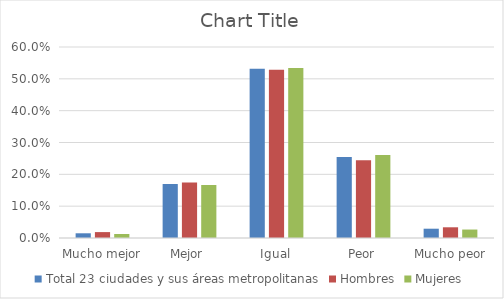
| Category | Total 23 ciudades y sus áreas metropolitanas | Hombres | Mujeres |
|---|---|---|---|
| Mucho mejor | 0.015 | 0.019 | 0.013 |
| Mejor | 0.17 | 0.175 | 0.167 |
| Igual | 0.532 | 0.529 | 0.534 |
| Peor | 0.255 | 0.245 | 0.261 |
| Mucho peor | 0.029 | 0.034 | 0.027 |